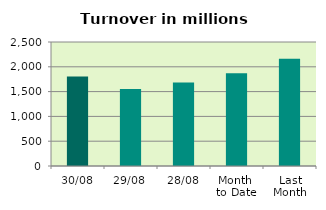
| Category | Series 0 |
|---|---|
| 30/08 | 1804.775 |
| 29/08 | 1550.135 |
| 28/08 | 1685.195 |
| Month 
to Date | 1871.504 |
| Last
Month | 2159.874 |